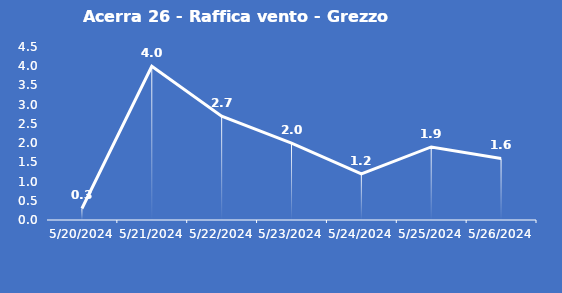
| Category | Acerra 26 - Raffica vento - Grezzo (m/s) |
|---|---|
| 5/20/24 | 0.3 |
| 5/21/24 | 4 |
| 5/22/24 | 2.7 |
| 5/23/24 | 2 |
| 5/24/24 | 1.2 |
| 5/25/24 | 1.9 |
| 5/26/24 | 1.6 |